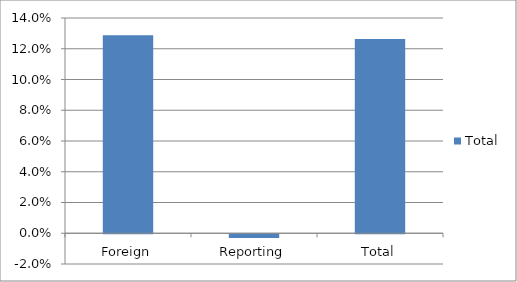
| Category | Total |
|---|---|
| Foreign | 0.129 |
| Reporting | -0.002 |
| Total | 0.126 |